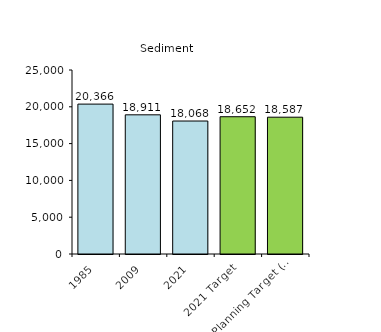
| Category | Series 0 |
|---|---|
| 1985 | 20365.936 |
| 2009 | 18910.756 |
| 2021 | 18067.98 |
| 2021 Target | 18651.772 |
| 2025 Planning Target (amt. allowed in Bay)  | 18587.026 |